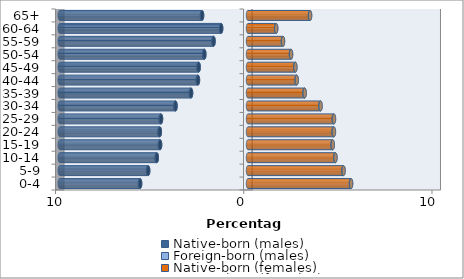
| Category | Native-born (males) | Foreign-born (males) | Native-born (females) | Foreign-born (females) |
|---|---|---|---|---|
| 0-4 | -5.731 | -0.009 | 5.47 | 0.009 |
| 5-9 | -5.302 | -0.01 | 5.07 | 0.009 |
| 10-14 | -4.843 | -0.013 | 4.637 | 0.011 |
| 15-19 | -4.669 | -0.018 | 4.492 | 0.014 |
| 20-24 | -4.682 | -0.03 | 4.546 | 0.022 |
| 25-29 | -4.62 | -0.026 | 4.552 | 0.02 |
| 30-34 | -3.848 | -0.024 | 3.842 | 0.018 |
| 35-39 | -3.024 | -0.019 | 3 | 0.014 |
| 40-44 | -2.658 | -0.015 | 2.581 | 0.011 |
| 45-49 | -2.62 | -0.012 | 2.509 | 0.008 |
| 50-54 | -2.318 | -0.009 | 2.283 | 0.006 |
| 55-59 | -1.829 | -0.007 | 1.856 | 0.005 |
| 60-64 | -1.426 | -0.006 | 1.494 | 0.005 |
| 65+ | -2.44 | -0.008 | 3.293 | 0.006 |